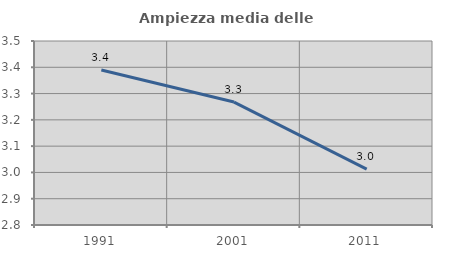
| Category | Ampiezza media delle famiglie |
|---|---|
| 1991.0 | 3.39 |
| 2001.0 | 3.268 |
| 2011.0 | 3.012 |